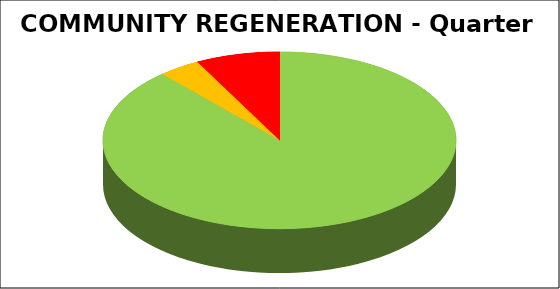
| Category | Series 0 |
|---|---|
| Green | 0.885 |
| Amber | 0.038 |
| Red | 0.077 |